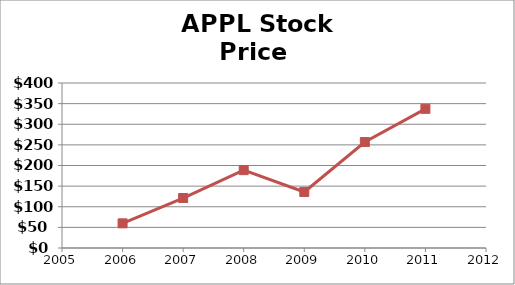
| Category | Price |
|---|---|
| 2006.0 | 59.77 |
| 2007.0 | 121.19 |
| 2008.0 | 188.75 |
| 2009.0 | 135.81 |
| 2010.0 | 256.88 |
| 2011.0 | 337.41 |